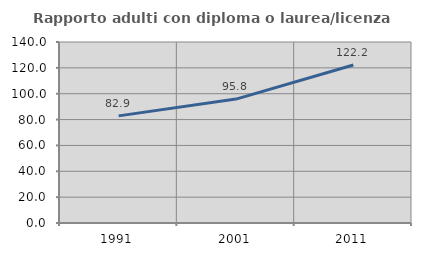
| Category | Rapporto adulti con diploma o laurea/licenza media  |
|---|---|
| 1991.0 | 82.857 |
| 2001.0 | 95.833 |
| 2011.0 | 122.222 |